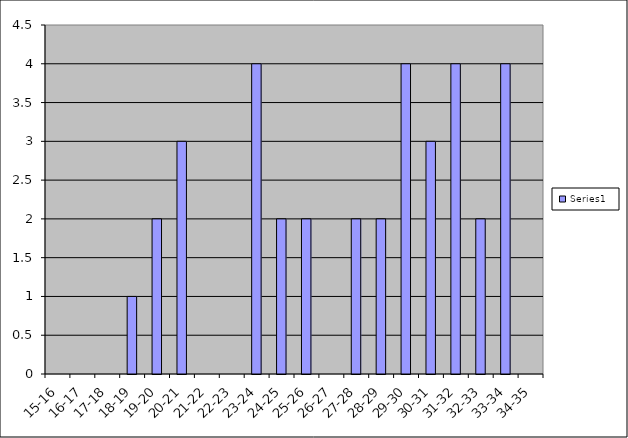
| Category | Series 0 |
|---|---|
| 15-16 | 0 |
| 16-17 | 0 |
| 17-18 | 0 |
| 18-19 | 1 |
| 19-20 | 2 |
| 20-21 | 3 |
| 21-22 | 0 |
| 22-23 | 0 |
| 23-24 | 4 |
| 24-25 | 2 |
| 25-26 | 2 |
| 26-27 | 0 |
| 27-28 | 2 |
| 28-29 | 2 |
| 29-30 | 4 |
| 30-31 | 3 |
| 31-32 | 4 |
| 32-33 | 2 |
| 33-34 | 4 |
| 34-35 | 0 |